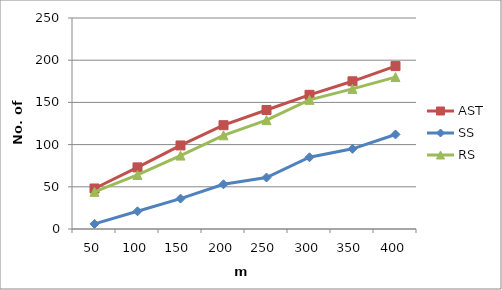
| Category | AST | SS | RS |
|---|---|---|---|
| 50.0 | 48 | 6 | 44 |
| 100.0 | 73 | 21 | 64 |
| 150.0 | 99 | 36 | 87 |
| 200.0 | 123 | 53 | 111 |
| 250.0 | 141 | 61 | 129 |
| 300.0 | 159 | 85 | 153 |
| 350.0 | 175 | 95 | 166 |
| 400.0 | 193 | 112 | 180 |